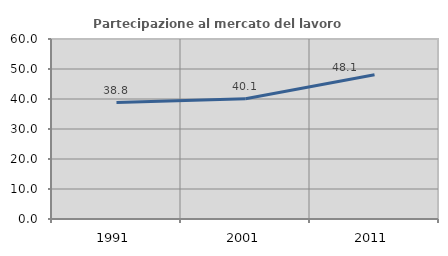
| Category | Partecipazione al mercato del lavoro  femminile |
|---|---|
| 1991.0 | 38.819 |
| 2001.0 | 40.1 |
| 2011.0 | 48.09 |